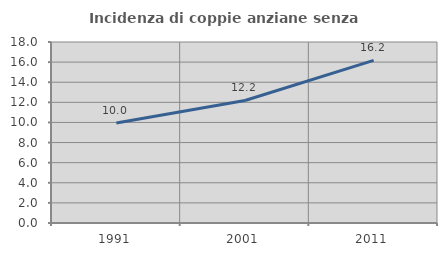
| Category | Incidenza di coppie anziane senza figli  |
|---|---|
| 1991.0 | 9.953 |
| 2001.0 | 12.183 |
| 2011.0 | 16.168 |